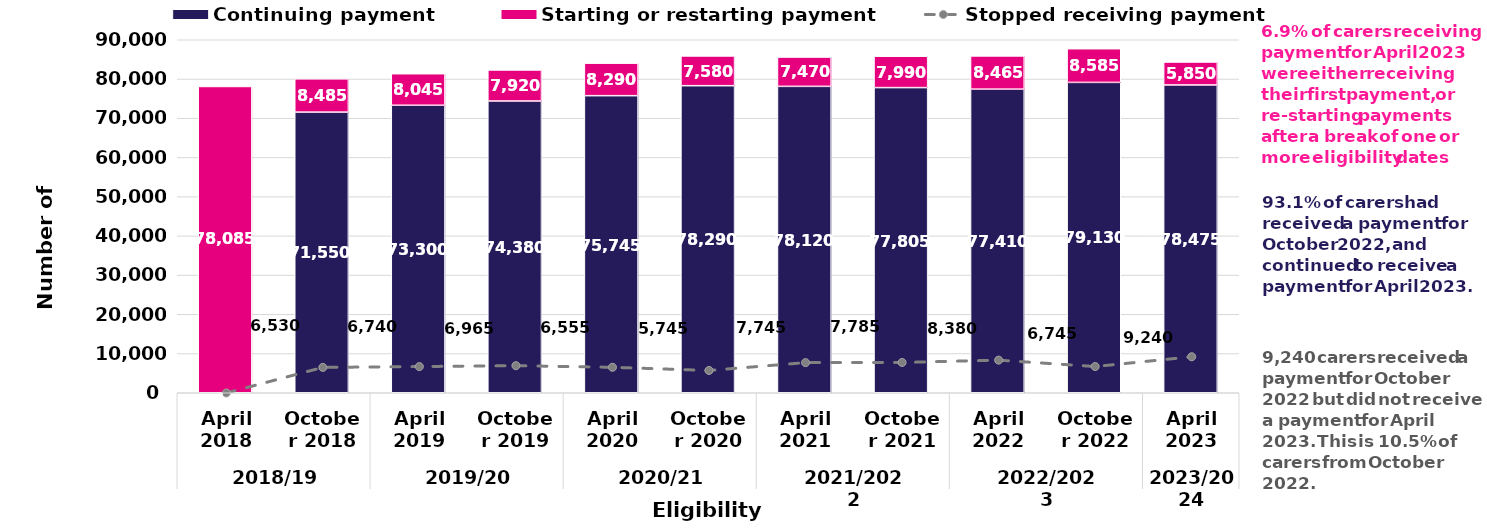
| Category | Continuing payment | Starting or restarting payment |
|---|---|---|
| 0 | 0 | 78085 |
| 1 | 71550 | 8485 |
| 2 | 73300 | 8045 |
| 3 | 74380 | 7920 |
| 4 | 75745 | 8290 |
| 5 | 78290 | 7580 |
| 6 | 78120 | 7470 |
| 7 | 77805 | 7990 |
| 8 | 77410 | 8465 |
| 9 | 79130 | 8585 |
| 10 | 78475 | 5850 |